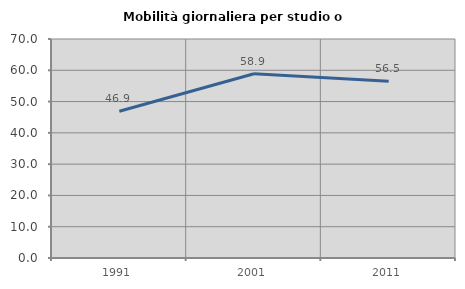
| Category | Mobilità giornaliera per studio o lavoro |
|---|---|
| 1991.0 | 46.91 |
| 2001.0 | 58.909 |
| 2011.0 | 56.475 |